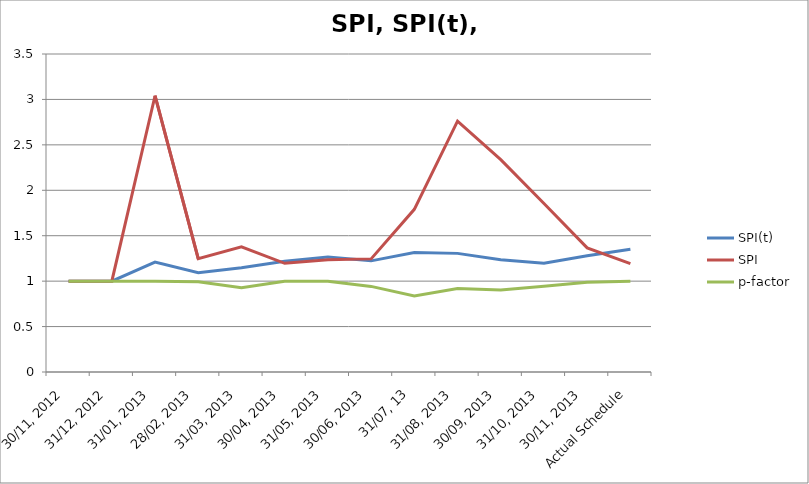
| Category | SPI(t) | SPI | p-factor |
|---|---|---|---|
| 30/11, 2012 | 1 | 1 | 1 |
| 31/12, 2012 | 1 | 1 | 1 |
| 31/01, 2013 | 1.209 | 3.041 | 1 |
| 28/02, 2013 | 1.092 | 1.246 | 0.992 |
| 31/03, 2013 | 1.147 | 1.378 | 0.927 |
| 30/04, 2013 | 1.218 | 1.196 | 1 |
| 31/05, 2013 | 1.265 | 1.236 | 1 |
| 30/06, 2013 | 1.223 | 1.245 | 0.942 |
| 31/07, 13 | 1.315 | 1.791 | 0.836 |
| 31/08, 2013 | 1.306 | 2.761 | 0.918 |
| 30/09, 2013 | 1.237 | 2.337 | 0.902 |
| 31/10, 2013 | 1.197 | 1.854 | 0.944 |
| 30/11, 2013 | 1.278 | 1.367 | 0.987 |
| Actual Schedule | 1.352 | 1.194 | 1 |